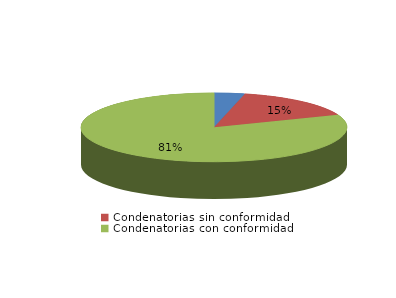
| Category | Series 0 |
|---|---|
| Absolutorias | 17 |
| Condenatorias sin conformidad | 70 |
| Condenatorias con conformidad | 371 |